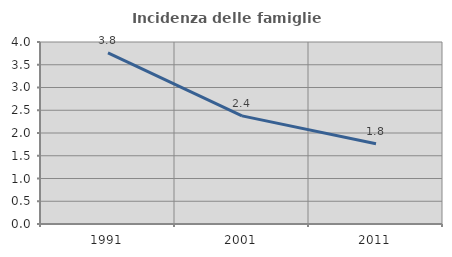
| Category | Incidenza delle famiglie numerose |
|---|---|
| 1991.0 | 3.762 |
| 2001.0 | 2.376 |
| 2011.0 | 1.763 |